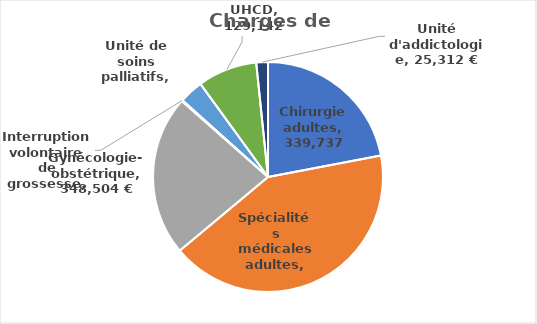
| Category | Charges de laboratoire |
|---|---|
| Chirurgie adultes | 339737 |
| Spécialités médicales adultes | 647784 |
| Gynécologie-obstétrique | 348504 |
| Interruption volontaire de grossesse | 2220 |
| Unité de soins palliatifs | 52018 |
| UHCD | 129142 |
| Unité d'addictologie | 25312 |